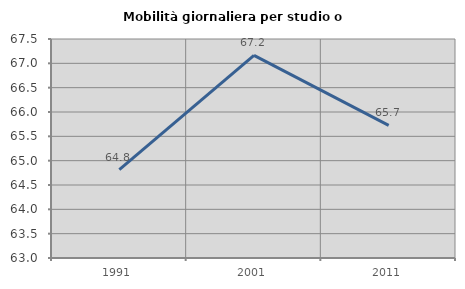
| Category | Mobilità giornaliera per studio o lavoro |
|---|---|
| 1991.0 | 64.818 |
| 2001.0 | 67.162 |
| 2011.0 | 65.725 |